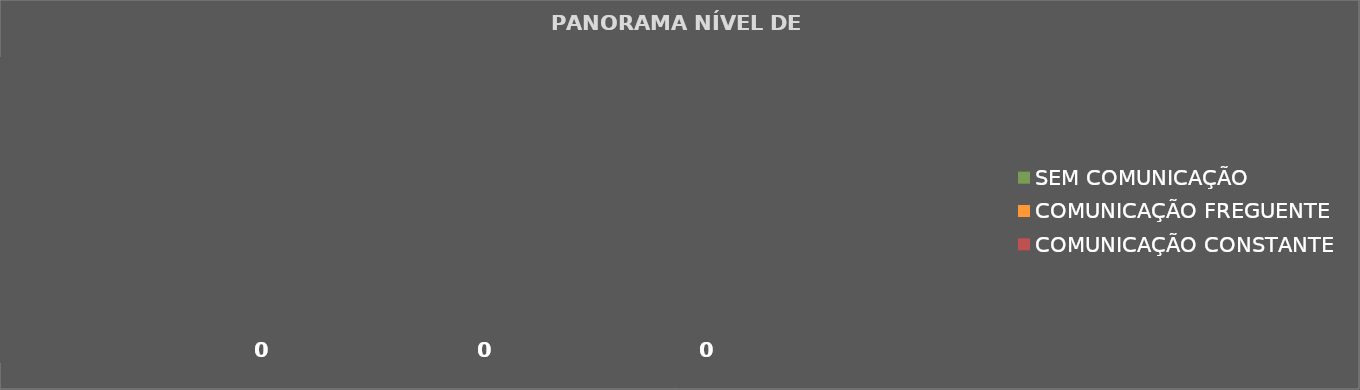
| Category | SEM COMUNICAÇÃO | COMUNICAÇÃO FREGUENTE | COMUNICAÇÃO CONSTANTE |
|---|---|---|---|
| 0 | 0 | 0 | 0 |